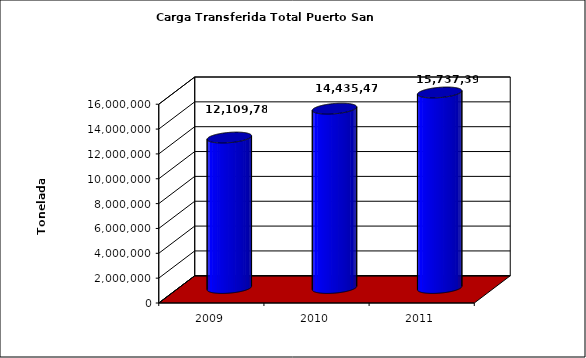
| Category | Series 0 |
|---|---|
| 2009.0 | 12109779.53 |
| 2010.0 | 14435471.74 |
| 2011.0 | 15737395.03 |